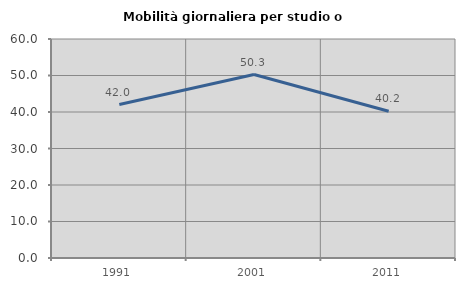
| Category | Mobilità giornaliera per studio o lavoro |
|---|---|
| 1991.0 | 42.041 |
| 2001.0 | 50.265 |
| 2011.0 | 40.212 |